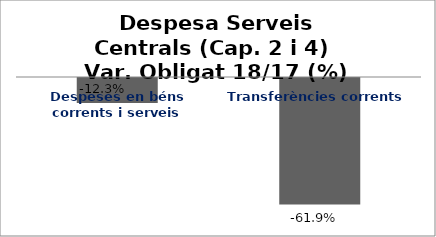
| Category | Series 0 |
|---|---|
| Despeses en béns corrents i serveis | -0.123 |
| Transferències corrents | -0.619 |